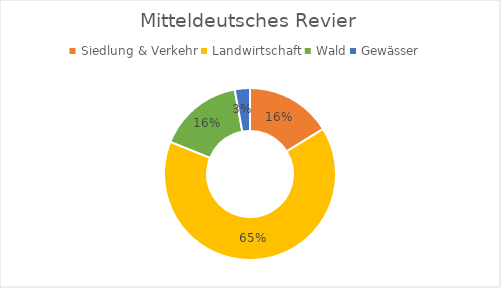
| Category | Mitteldeutsches Revier |
|---|---|
| Siedlung & Verkehr | 163672 |
| Landwirtschaft | 655366 |
| Wald | 161948 |
| Gewässer | 28746 |